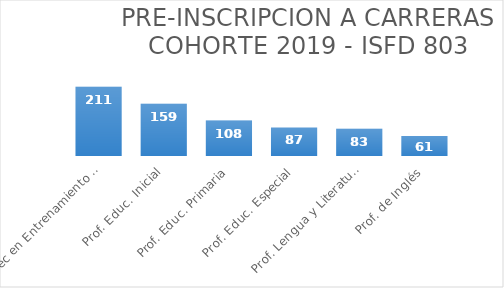
| Category | Series 0 |
|---|---|
| Tec en Entrenamiento Deportivo | 211 |
| Prof. Educ. Inicial | 159 |
| Prof. Educ. Primaria | 108 |
| Prof. Educ. Especial | 87 |
| Prof. Lengua y Literatura | 83 |
| Prof. de Inglés | 61 |